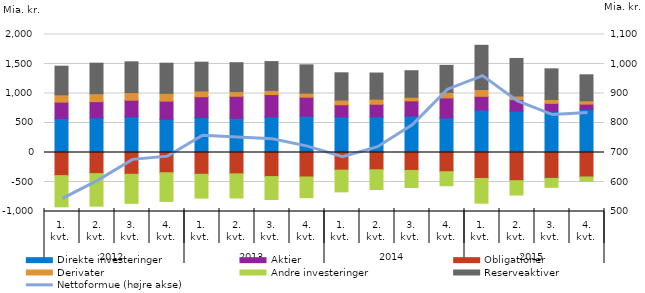
| Category | Direkte investeringer | Aktier | Obligationer | Derivater | Andre investeringer | Reserveaktiver |
|---|---|---|---|---|---|---|
| 0 | 579 | 275 | -392 | 124 | -529 | 485 |
| 1 | 587 | 275 | -358 | 135 | -552 | 517 |
| 2 | 605 | 281 | -369 | 130 | -493 | 521 |
| 3 | 563 | 308 | -343 | 131 | -486 | 512 |
| 4 | 591 | 355 | -369 | 97 | -404 | 488 |
| 5 | 579 | 374 | -362 | 80 | -409 | 489 |
| 6 | 603 | 379 | -408 | 71 | -388 | 488 |
| 7 | 614 | 323 | -415 | 69 | -351 | 480 |
| 8 | 606 | 203 | -299 | 80 | -368 | 462 |
| 9 | 604 | 214 | -293 | 86 | -335 | 443 |
| 10 | 617 | 258 | -304 | 62 | -289 | 449 |
| 11 | 585 | 340 | -326 | 94 | -237 | 458 |
| 12 | 719 | 233 | -440 | 115 | -419 | 750 |
| 13 | 701 | 194 | -478 | 62 | -243 | 637 |
| 14 | 698 | 135 | -439 | 66 | -151 | 519 |
| 15 | 733 | 87 | -415 | 57 | -70 | 440 |